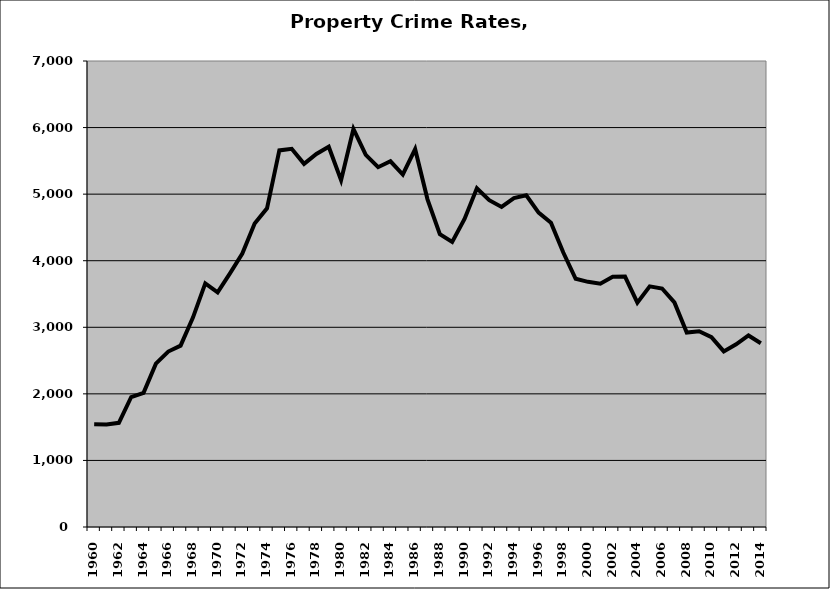
| Category | Property |
|---|---|
| 1960.0 | 1544.876 |
| 1961.0 | 1540.598 |
| 1962.0 | 1564.634 |
| 1963.0 | 1952.823 |
| 1964.0 | 2016 |
| 1965.0 | 2454.545 |
| 1966.0 | 2635.294 |
| 1967.0 | 2723.897 |
| 1968.0 | 3145.487 |
| 1969.0 | 3658.865 |
| 1970.0 | 3523.809 |
| 1971.0 | 3809.265 |
| 1972.0 | 4108 |
| 1973.0 | 4558.788 |
| 1974.0 | 4786.647 |
| 1975.0 | 5656.818 |
| 1976.0 | 5680.628 |
| 1977.0 | 5454.791 |
| 1978.0 | 5604.218 |
| 1979.0 | 5712.562 |
| 1980.0 | 5209.682 |
| 1981.0 | 5979.126 |
| 1982.0 | 5588.813 |
| 1983.0 | 5404.802 |
| 1984.0 | 5493.6 |
| 1985.0 | 5295.202 |
| 1986.0 | 5675.468 |
| 1987.0 | 4922.095 |
| 1988.0 | 4398.83 |
| 1989.0 | 4282.163 |
| 1990.0 | 4628.184 |
| 1991.0 | 5087.719 |
| 1992.0 | 4909.029 |
| 1993.0 | 4807.179 |
| 1994.0 | 4941.749 |
| 1995.0 | 4982.947 |
| 1996.0 | 4722.735 |
| 1997.0 | 4571.429 |
| 1998.0 | 4123.127 |
| 1999.0 | 3728.652 |
| 2000.0 | 3682.537 |
| 2001.0 | 3655.13 |
| 2002.0 | 3759.731 |
| 2003.0 | 3761.646 |
| 2004.0 | 3370.86 |
| 2005.0 | 3614.759 |
| 2006.0 | 3581.955 |
| 2007.0 | 3373.92 |
| 2008.0 | 2920.545 |
| 2009.0 | 2940.414 |
| 2010.0 | 2852.452 |
| 2011.0 | 2637.803 |
| 2012.0 | 2743.641 |
| 2013.0 | 2877.008 |
| 2014.0 | 2760.027 |